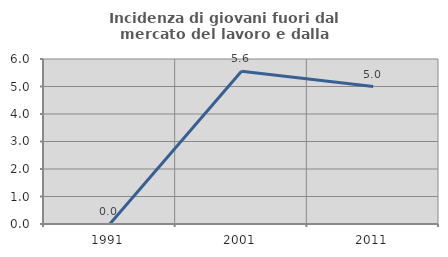
| Category | Incidenza di giovani fuori dal mercato del lavoro e dalla formazione  |
|---|---|
| 1991.0 | 0 |
| 2001.0 | 5.556 |
| 2011.0 | 5 |